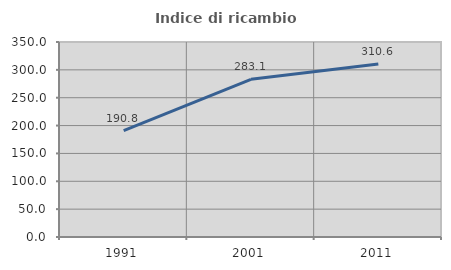
| Category | Indice di ricambio occupazionale  |
|---|---|
| 1991.0 | 190.769 |
| 2001.0 | 283.051 |
| 2011.0 | 310.606 |